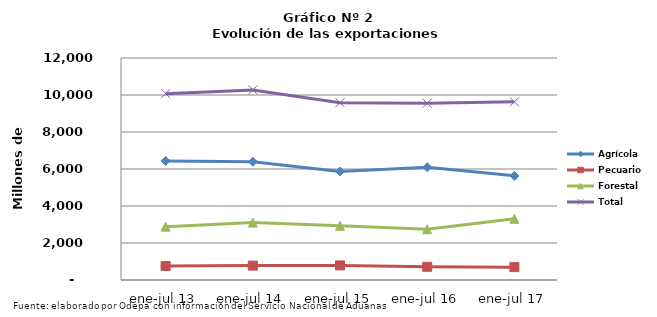
| Category | Agrícola | Pecuario | Forestal | Total |
|---|---|---|---|---|
| ene-jul 13 | 6434451 | 756167 | 2883011 | 10073629 |
| ene-jul 14 | 6393372 | 777756 | 3103873 | 10275001 |
| ene-jul 15 | 5866355 | 789670 | 2928998 | 9585023 |
| ene-jul 16 | 6099609 | 715230 | 2742013 | 9556852 |
| ene-jul 17 | 5629561 | 694774 | 3305521 | 9629856 |